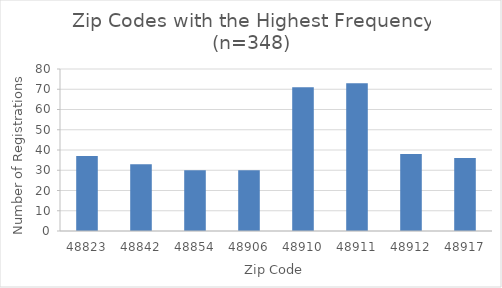
| Category | Series 0 |
|---|---|
| 48823.0 | 37 |
| 48842.0 | 33 |
| 48854.0 | 30 |
| 48906.0 | 30 |
| 48910.0 | 71 |
| 48911.0 | 73 |
| 48912.0 | 38 |
| 48917.0 | 36 |